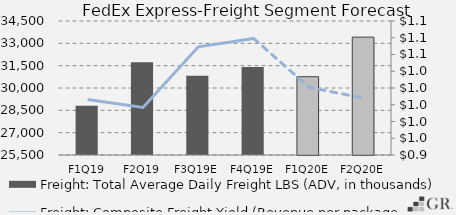
| Category | Freight: Total Average Daily Freight LBS (ADV, in thousands) |
|---|---|
|  F1Q19  | 28800 |
|  F2Q19  | 31733.7 |
|  F3Q19E  | 30823.477 |
|  F4Q19E  | 31409.872 |
|  F1Q20E  | 30757.001 |
|  F2Q20E  | 33416.453 |